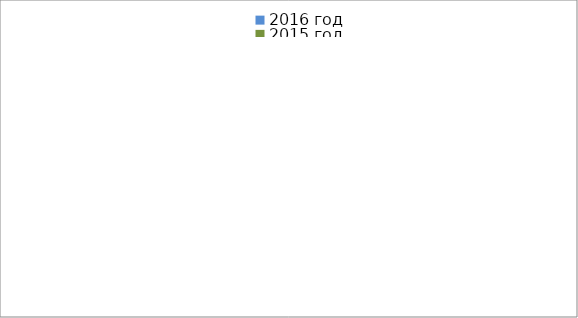
| Category | 2016 год | 2015 год |
|---|---|---|
|  - поджог | 38 | 28 |
|  - неосторожное обращение с огнём | 22 | 50 |
|  - НПТЭ электрооборудования | 16 | 12 |
|  - НПУ и Э печей | 30 | 48 |
|  - НПУ и Э транспортных средств | 28 | 36 |
|   -Шалость с огнем детей | 6 | 3 |
|  -НППБ при эксплуатации эл.приборов | 13 | 12 |
|  - курение | 18 | 21 |
| - прочие | 95 | 79 |
| - не установленные причины | 12 | 13 |